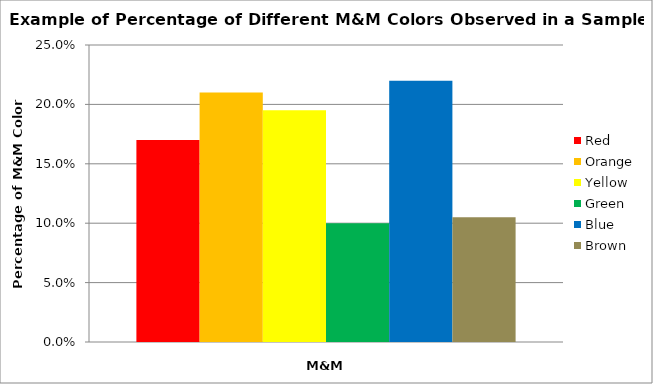
| Category | Red | Orange | Yellow | Green | Blue | Brown |
|---|---|---|---|---|---|---|
| Group Percentage | 0.17 | 0.21 | 0.195 | 0.1 | 0.22 | 0.105 |